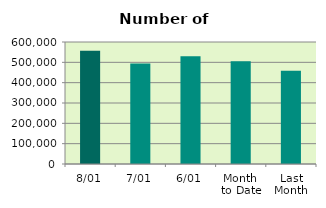
| Category | Series 0 |
|---|---|
| 8/01 | 556812 |
| 7/01 | 494782 |
| 6/01 | 529474 |
| Month 
to Date | 505240.4 |
| Last
Month | 458836.4 |